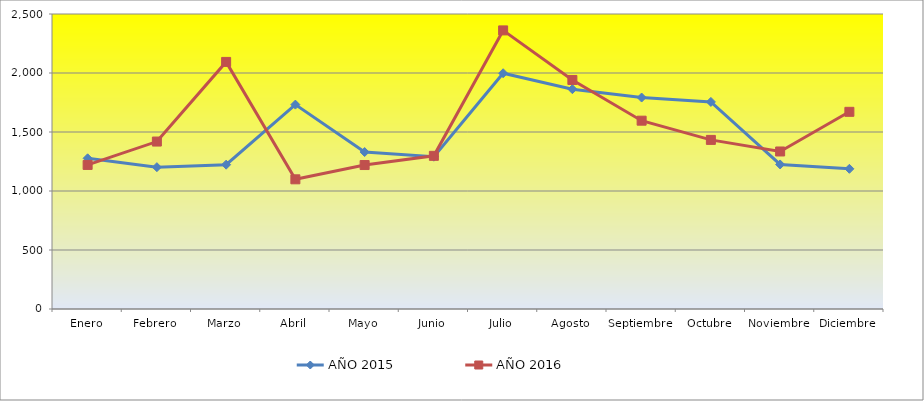
| Category | AÑO 2015 | AÑO 2016 |
|---|---|---|
| Enero | 1277 | 1221 |
| Febrero | 1202 | 1419 |
| Marzo | 1223 | 2094 |
| Abril | 1732 | 1099 |
| Mayo | 1330 | 1220 |
| Junio | 1291 | 1298 |
| Julio | 1998 | 2361 |
| Agosto | 1863 | 1941 |
| Septiembre | 1792 | 1596 |
| Octubre | 1755 | 1433 |
| Noviembre | 1225 | 1335 |
| Diciembre | 1188 | 1671 |